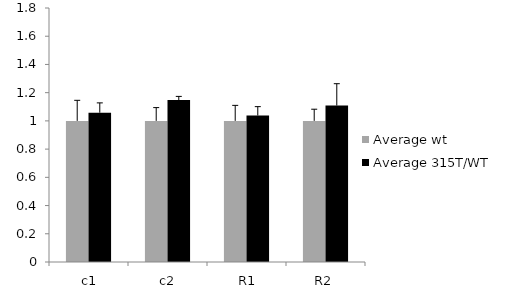
| Category | Average wt | Average 315T/WT |
|---|---|---|
|  c1 | 1 | 1.058 |
|  c2 | 1 | 1.148 |
|  R1 | 1 | 1.038 |
| R2 | 1 | 1.109 |